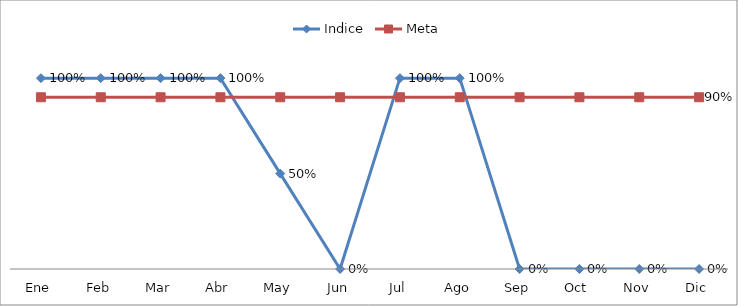
| Category | Indice | Meta |
|---|---|---|
| Ene | 1 | 0.9 |
| Feb | 1 | 0.9 |
| Mar | 1 | 0.9 |
| Abr | 1 | 0.9 |
| May | 0.5 | 0.9 |
| Jun | 0 | 0.9 |
| Jul | 1 | 0.9 |
| Ago | 1 | 0.9 |
| Sep | 0 | 0.9 |
| Oct | 0 | 0.9 |
| Nov | 0 | 0.9 |
| Dic | 0 | 0.9 |